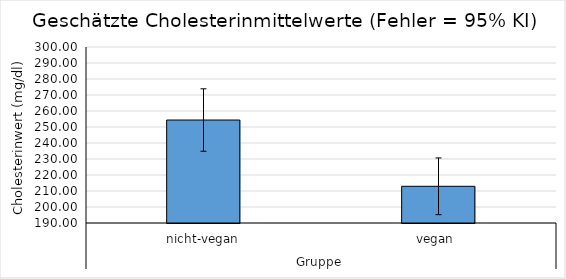
| Category | Series 0 |
|---|---|
| 0 | 254.356 |
| 1 | 212.934 |